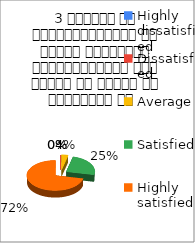
| Category | 3 शिक्षक का विद्यार्थियों के प्रति व्यव्हार मित्रतापूर्ण एवं सहयोग के भावना से परिपूर्ण था   |
|---|---|
| Highly dissatisfied | 0 |
| Dissatisfied | 0 |
| Average | 2 |
| Satisfied | 13 |
| Highly satisfied | 38 |